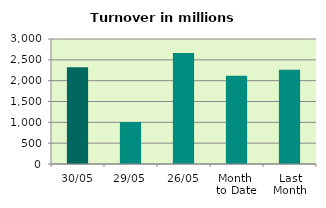
| Category | Series 0 |
|---|---|
| 30/05 | 2321.167 |
| 29/05 | 1010.179 |
| 26/05 | 2665.551 |
| Month 
to Date | 2117.442 |
| Last
Month | 2261.282 |